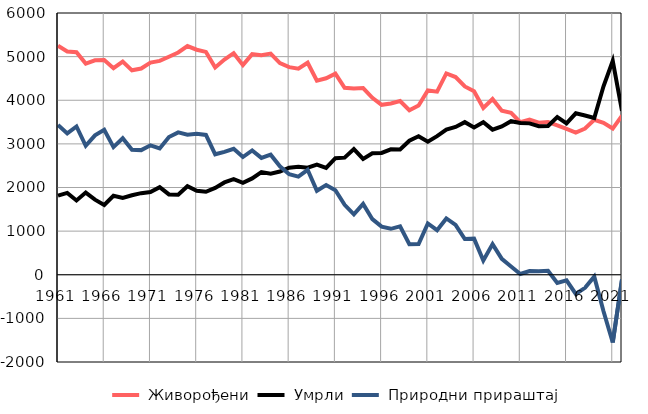
| Category |  Живорођени |  Умрли |  Природни прираштај |
|---|---|---|---|
| 1961.0 | 5248 | 1812 | 3436 |
| 1962.0 | 5116 | 1877 | 3239 |
| 1963.0 | 5102 | 1703 | 3399 |
| 1964.0 | 4840 | 1884 | 2956 |
| 1965.0 | 4916 | 1722 | 3194 |
| 1966.0 | 4921 | 1599 | 3322 |
| 1967.0 | 4736 | 1810 | 2926 |
| 1968.0 | 4888 | 1760 | 3128 |
| 1969.0 | 4686 | 1821 | 2865 |
| 1970.0 | 4727 | 1870 | 2857 |
| 1971.0 | 4863 | 1896 | 2967 |
| 1972.0 | 4902 | 2008 | 2894 |
| 1973.0 | 4998 | 1841 | 3157 |
| 1974.0 | 5095 | 1832 | 3263 |
| 1975.0 | 5241 | 2030 | 3211 |
| 1976.0 | 5158 | 1927 | 3231 |
| 1977.0 | 5108 | 1903 | 3205 |
| 1978.0 | 4751 | 1990 | 2761 |
| 1979.0 | 4933 | 2116 | 2817 |
| 1980.0 | 5078 | 2190 | 2888 |
| 1981.0 | 4805 | 2107 | 2698 |
| 1982.0 | 5057 | 2208 | 2849 |
| 1983.0 | 5034 | 2355 | 2679 |
| 1984.0 | 5070 | 2317 | 2753 |
| 1985.0 | 4852 | 2366 | 2486 |
| 1986.0 | 4759 | 2454 | 2305 |
| 1987.0 | 4724 | 2475 | 2249 |
| 1988.0 | 4860 | 2454 | 2406 |
| 1989.0 | 4448 | 2524 | 1924 |
| 1990.0 | 4503 | 2448 | 2055 |
| 1991.0 | 4609 | 2673 | 1936 |
| 1992.0 | 4286 | 2684 | 1602 |
| 1993.0 | 4268 | 2882 | 1386 |
| 1994.0 | 4278 | 2654 | 1624 |
| 1995.0 | 4057 | 2783 | 1274 |
| 1996.0 | 3895 | 2792 | 1103 |
| 1997.0 | 3927 | 2874 | 1053 |
| 1998.0 | 3981 | 2872 | 1109 |
| 1999.0 | 3771 | 3071 | 700 |
| 2000.0 | 3881 | 3176 | 705 |
| 2001.0 | 4224 | 3048 | 1176 |
| 2002.0 | 4198 | 3176 | 1022 |
| 2003.0 | 4615 | 3325 | 1290 |
| 2004.0 | 4532 | 3387 | 1145 |
| 2005.0 | 4316 | 3498 | 818 |
| 2006.0 | 4205 | 3378 | 827 |
| 2007.0 | 3824 | 3496 | 328 |
| 2008.0 | 4029 | 3326 | 703 |
| 2009.0 | 3762 | 3399 | 363 |
| 2010.0 | 3710 | 3520 | 190 |
| 2011.0 | 3496 | 3478 | 18 |
| 2012.0 | 3554 | 3470 | 84 |
| 2013.0 | 3487 | 3405 | 82 |
| 2014.0 | 3500 | 3409 | 91 |
| 2015.0 | 3426 | 3612 | -186 |
| 2016.0 | 3343 | 3471 | -128 |
| 2017.0 | 3260 | 3701 | -441 |
| 2018.0 | 3351 | 3651 | -300 |
| 2019.0 | 3550 | 3593 | -43 |
| 2020.0 | 3483 | 4320 | -837 |
| 2021.0 | 3351 | 4905 | -1554 |
| 2022.0 | 3649 | 3757 | -108 |